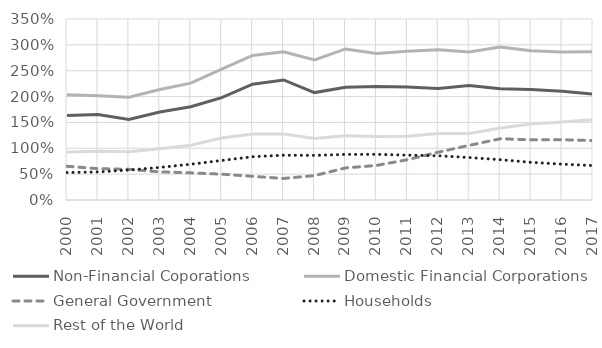
| Category | Non-Financial Coporations | Domestic Financial Corporations | General Government | Households | Rest of the World |
|---|---|---|---|---|---|
| 2000 | 1.633 | 2.037 | 0.652 | 0.531 | 0.928 |
| 2001 | 1.655 | 2.015 | 0.606 | 0.543 | 0.941 |
| 2002 | 1.557 | 1.989 | 0.593 | 0.58 | 0.934 |
| 2003 | 1.703 | 2.136 | 0.544 | 0.63 | 0.991 |
| 2004 | 1.802 | 2.26 | 0.525 | 0.692 | 1.058 |
| 2005 | 1.98 | 2.532 | 0.5 | 0.764 | 1.2 |
| 2006 | 2.24 | 2.795 | 0.457 | 0.837 | 1.277 |
| 2007 | 2.322 | 2.865 | 0.417 | 0.866 | 1.274 |
| 2008 | 2.077 | 2.709 | 0.472 | 0.863 | 1.19 |
| 2009 | 2.182 | 2.921 | 0.62 | 0.881 | 1.243 |
| 2010 | 2.195 | 2.833 | 0.668 | 0.883 | 1.226 |
| 2011 | 2.185 | 2.878 | 0.779 | 0.867 | 1.235 |
| 2012 | 2.154 | 2.906 | 0.925 | 0.855 | 1.285 |
| 2013 | 2.216 | 2.862 | 1.057 | 0.821 | 1.285 |
| 2014 | 2.152 | 2.96 | 1.184 | 0.779 | 1.393 |
| 2015 | 2.137 | 2.884 | 1.164 | 0.728 | 1.468 |
| 2016 | 2.102 | 2.862 | 1.166 | 0.693 | 1.51 |
| 2017 | 2.05 | 2.865 | 1.148 | 0.666 | 1.553 |